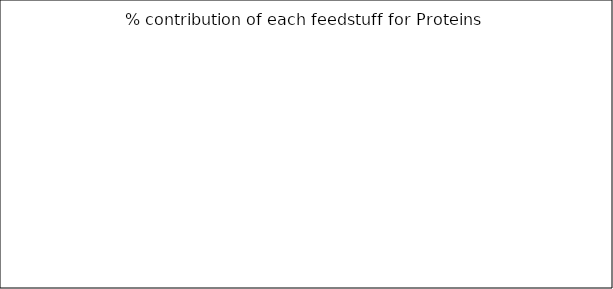
| Category | % of contribution off each feedstuff for Proteins |
|---|---|
| 0.0 | 0 |
| 0.0 | 0 |
| 0.0 | 0 |
| 0.0 | 0 |
| 0.0 | 0 |
| 0.0 | 0 |
| 0.0 | 0 |
| 0.0 | 0 |
| 0.0 | 0 |
| 0.0 | 0 |